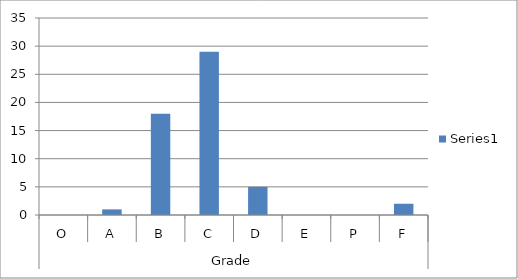
| Category | Series 0 |
|---|---|
| 0 | 0 |
| 1 | 1 |
| 2 | 18 |
| 3 | 29 |
| 4 | 5 |
| 5 | 0 |
| 6 | 0 |
| 7 | 2 |